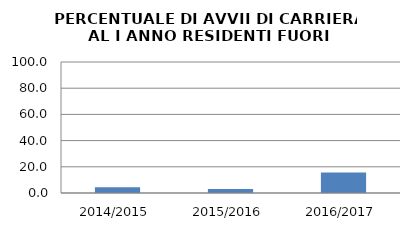
| Category | 2014/2015 2015/2016 2016/2017 |
|---|---|
| 2014/2015 | 4.348 |
| 2015/2016 | 3.125 |
| 2016/2017 | 15.625 |